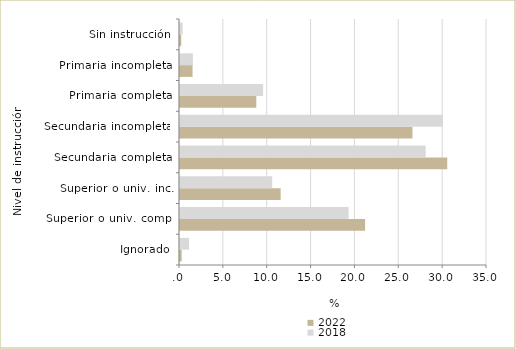
| Category | 2022 | 2018 |
|---|---|---|
| Ignorado | 0.188 | 1.033 |
| Superior o univ. comp. | 21.102 | 19.217 |
| Superior o univ. inc. | 11.474 | 10.509 |
| Secundaria completa | 30.467 | 28.011 |
| Secundaria incompleta | 26.5 | 29.982 |
| Primaria completa | 8.699 | 9.476 |
| Primaria incompleta | 1.431 | 1.469 |
| Sin instrucción | 0.138 | 0.303 |